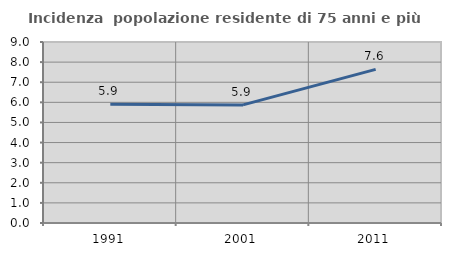
| Category | Incidenza  popolazione residente di 75 anni e più |
|---|---|
| 1991.0 | 5.906 |
| 2001.0 | 5.872 |
| 2011.0 | 7.637 |